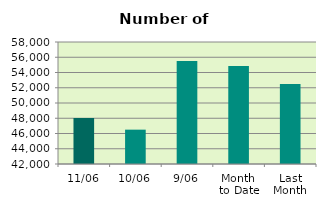
| Category | Series 0 |
|---|---|
| 11/06 | 48046 |
| 10/06 | 46504 |
| 9/06 | 55502 |
| Month 
to Date | 54860.889 |
| Last
Month | 52506.1 |